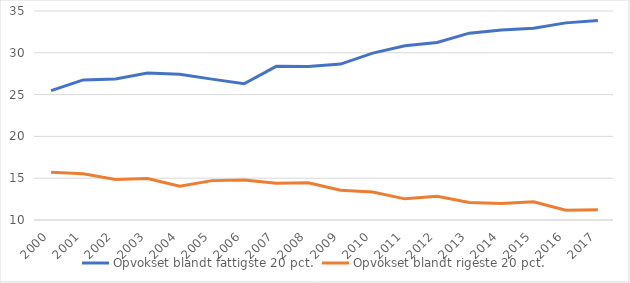
| Category | Opvokset blandt fattigste 20 pct. | Opvokset blandt rigeste 20 pct. |
|---|---|---|
| 2000.0 | 25.47 | 15.72 |
| 2001.0 | 26.76 | 15.54 |
| 2002.0 | 26.88 | 14.84 |
| 2003.0 | 27.58 | 14.96 |
| 2004.0 | 27.44 | 14.05 |
| 2005.0 | 26.85 | 14.71 |
| 2006.0 | 26.3 | 14.77 |
| 2007.0 | 28.38 | 14.4 |
| 2008.0 | 28.37 | 14.46 |
| 2009.0 | 28.65 | 13.57 |
| 2010.0 | 29.96 | 13.35 |
| 2011.0 | 30.84 | 12.53 |
| 2012.0 | 31.24 | 12.84 |
| 2013.0 | 32.35 | 12.09 |
| 2014.0 | 32.72 | 11.98 |
| 2015.0 | 32.94 | 12.17 |
| 2016.0 | 33.58 | 11.17 |
| 2017.0 | 33.86 | 11.24 |